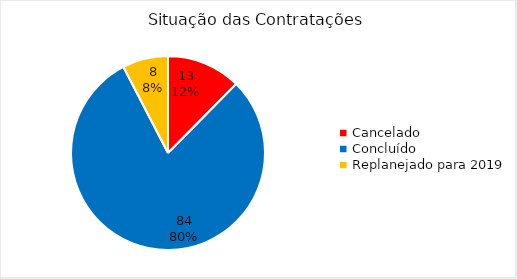
| Category | Total |
|---|---|
| Cancelado | 13 |
| Concluído | 84 |
| Replanejado para 2019 | 8 |